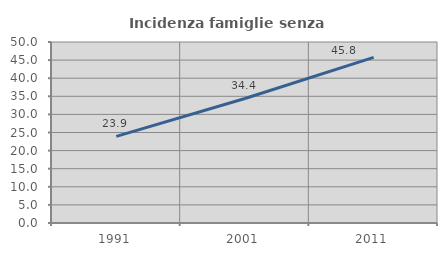
| Category | Incidenza famiglie senza nuclei |
|---|---|
| 1991.0 | 23.919 |
| 2001.0 | 34.406 |
| 2011.0 | 45.76 |